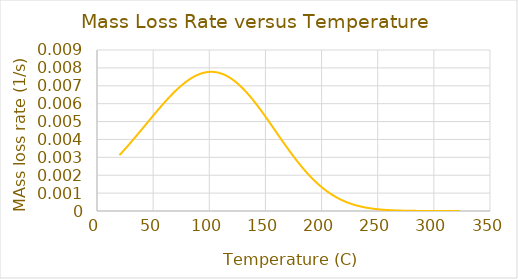
| Category | 1/s |
|---|---|
| 20.004478 | 0.003 |
| 20.99651 | 0.003 |
| 21.996464 | 0.003 |
| 22.99642 | 0.003 |
| 23.996374 | 0.003 |
| 24.99633 | 0.003 |
| 25.996284 | 0.004 |
| 26.996239 | 0.004 |
| 27.996193 | 0.004 |
| 28.996145 | 0.004 |
| 29.996099 | 0.004 |
| 30.996052 | 0.004 |
| 31.996004 | 0.004 |
| 32.995956 | 0.004 |
| 33.995911 | 0.004 |
| 34.995861 | 0.004 |
| 35.995815 | 0.004 |
| 36.995766 | 0.004 |
| 37.99572 | 0.004 |
| 38.99567 | 0.004 |
| 39.995621 | 0.005 |
| 40.995575 | 0.005 |
| 41.995525 | 0.005 |
| 42.99548 | 0.005 |
| 43.99543 | 0.005 |
| 44.995384 | 0.005 |
| 45.995335 | 0.005 |
| 46.995289 | 0.005 |
| 47.995239 | 0.005 |
| 48.995193 | 0.005 |
| 49.995144 | 0.005 |
| 50.995098 | 0.005 |
| 51.995052 | 0.005 |
| 52.995007 | 0.006 |
| 53.994961 | 0.006 |
| 54.994915 | 0.006 |
| 55.994873 | 0.006 |
| 56.994827 | 0.006 |
| 57.994781 | 0.006 |
| 58.99474 | 0.006 |
| 59.994698 | 0.006 |
| 60.994656 | 0.006 |
| 61.994614 | 0.006 |
| 62.994572 | 0.006 |
| 63.994534 | 0.006 |
| 64.994492 | 0.006 |
| 65.994453 | 0.006 |
| 66.994415 | 0.007 |
| 67.994377 | 0.007 |
| 68.994347 | 0.007 |
| 69.994308 | 0.007 |
| 70.994278 | 0.007 |
| 71.99424 | 0.007 |
| 72.994209 | 0.007 |
| 73.994179 | 0.007 |
| 74.994148 | 0.007 |
| 75.994118 | 0.007 |
| 76.994095 | 0.007 |
| 77.994064 | 0.007 |
| 78.994041 | 0.007 |
| 79.994019 | 0.007 |
| 80.993996 | 0.007 |
| 81.993973 | 0.007 |
| 82.99395 | 0.007 |
| 83.993935 | 0.007 |
| 84.993919 | 0.007 |
| 85.993896 | 0.007 |
| 86.993889 | 0.008 |
| 87.993874 | 0.008 |
| 88.993858 | 0.008 |
| 89.993851 | 0.008 |
| 90.993843 | 0.008 |
| 91.993835 | 0.008 |
| 92.993828 | 0.008 |
| 93.993828 | 0.008 |
| 94.99382 | 0.008 |
| 95.99382 | 0.008 |
| 96.99382 | 0.008 |
| 97.993828 | 0.008 |
| 98.993828 | 0.008 |
| 99.993835 | 0.008 |
| 100.99384 | 0.008 |
| 101.99385 | 0.008 |
| 102.99387 | 0.008 |
| 103.99387 | 0.008 |
| 104.99389 | 0.008 |
| 105.9939 | 0.008 |
| 106.99393 | 0.008 |
| 107.99394 | 0.008 |
| 108.99397 | 0.008 |
| 109.99399 | 0.008 |
| 110.99401 | 0.008 |
| 111.99404 | 0.008 |
| 112.99406 | 0.008 |
| 113.99409 | 0.008 |
| 114.99413 | 0.008 |
| 115.99416 | 0.008 |
| 116.99419 | 0.008 |
| 117.99423 | 0.007 |
| 118.99426 | 0.007 |
| 119.99431 | 0.007 |
| 120.99435 | 0.007 |
| 121.99438 | 0.007 |
| 122.99443 | 0.007 |
| 123.99448 | 0.007 |
| 124.99452 | 0.007 |
| 125.99457 | 0.007 |
| 126.99462 | 0.007 |
| 127.99467 | 0.007 |
| 128.99472 | 0.007 |
| 129.99478 | 0.007 |
| 130.99483 | 0.007 |
| 131.99489 | 0.007 |
| 132.99493 | 0.007 |
| 133.995 | 0.007 |
| 134.99506 | 0.007 |
| 135.99512 | 0.006 |
| 136.99518 | 0.006 |
| 137.99524 | 0.006 |
| 138.9953 | 0.006 |
| 139.99536 | 0.006 |
| 140.99542 | 0.006 |
| 141.9955 | 0.006 |
| 142.99556 | 0.006 |
| 143.99562 | 0.006 |
| 144.9957 | 0.006 |
| 145.99576 | 0.006 |
| 146.99583 | 0.006 |
| 147.9959 | 0.005 |
| 148.99597 | 0.005 |
| 149.99603 | 0.005 |
| 150.99611 | 0.005 |
| 151.99617 | 0.005 |
| 152.99625 | 0.005 |
| 153.99631 | 0.005 |
| 154.99638 | 0.005 |
| 155.99646 | 0.005 |
| 156.99652 | 0.005 |
| 157.9966 | 0.005 |
| 158.99666 | 0.004 |
| 159.99673 | 0.004 |
| 160.9968 | 0.004 |
| 161.99687 | 0.004 |
| 162.99695 | 0.004 |
| 163.99701 | 0.004 |
| 164.99709 | 0.004 |
| 165.99715 | 0.004 |
| 166.99721 | 0.004 |
| 167.99728 | 0.004 |
| 168.99734 | 0.004 |
| 169.99742 | 0.003 |
| 170.99748 | 0.003 |
| 171.99754 | 0.003 |
| 172.9976 | 0.003 |
| 173.99768 | 0.003 |
| 174.99774 | 0.003 |
| 175.9978 | 0.003 |
| 176.99786 | 0.003 |
| 177.99792 | 0.003 |
| 178.99799 | 0.003 |
| 179.99805 | 0.003 |
| 180.99809 | 0.003 |
| 181.99815 | 0.002 |
| 182.99821 | 0.002 |
| 183.99828 | 0.002 |
| 184.99832 | 0.002 |
| 185.99838 | 0.002 |
| 186.99843 | 0.002 |
| 187.99847 | 0.002 |
| 188.99854 | 0.002 |
| 189.99858 | 0.002 |
| 190.99863 | 0.002 |
| 191.99867 | 0.002 |
| 192.99872 | 0.002 |
| 193.99876 | 0.002 |
| 194.99881 | 0.002 |
| 195.99886 | 0.002 |
| 196.9989 | 0.002 |
| 197.99893 | 0.001 |
| 198.99898 | 0.001 |
| 199.99902 | 0.001 |
| 200.99905 | 0.001 |
| 201.9991 | 0.001 |
| 202.99913 | 0.001 |
| 203.99916 | 0.001 |
| 204.99919 | 0.001 |
| 205.99924 | 0.001 |
| 206.99927 | 0.001 |
| 207.9993 | 0.001 |
| 208.99933 | 0.001 |
| 209.99936 | 0.001 |
| 210.99937 | 0.001 |
| 211.9994 | 0.001 |
| 212.99944 | 0.001 |
| 213.99947 | 0.001 |
| 214.99948 | 0.001 |
| 215.99951 | 0.001 |
| 216.99953 | 0.001 |
| 217.99956 | 0.001 |
| 218.99957 | 0.001 |
| 219.9996 | 0.001 |
| 220.99962 | 0.001 |
| 221.99963 | 0.001 |
| 222.99965 | 0 |
| 223.99966 | 0 |
| 224.99968 | 0 |
| 225.99971 | 0 |
| 226.99973 | 0 |
| 227.99973 | 0 |
| 228.99974 | 0 |
| 229.99976 | 0 |
| 230.99977 | 0 |
| 231.99979 | 0 |
| 232.9998 | 0 |
| 233.9998 | 0 |
| 234.99982 | 0 |
| 235.99983 | 0 |
| 236.99983 | 0 |
| 237.99985 | 0 |
| 238.99986 | 0 |
| 239.99986 | 0 |
| 240.99988 | 0 |
| 241.99988 | 0 |
| 242.99989 | 0 |
| 243.99989 | 0 |
| 244.99991 | 0 |
| 245.99991 | 0 |
| 246.99991 | 0 |
| 247.99992 | 0 |
| 248.99992 | 0 |
| 249.99992 | 0 |
| 250.99994 | 0 |
| 251.99994 | 0 |
| 252.99994 | 0 |
| 253.99995 | 0 |
| 254.99995 | 0 |
| 255.99995 | 0 |
| 256.99997 | 0 |
| 257.99997 | 0 |
| 258.99997 | 0 |
| 259.99997 | 0 |
| 260.99997 | 0 |
| 261.99997 | 0 |
| 262.99997 | 0 |
| 263.99997 | 0 |
| 264.99997 | 0 |
| 265.99997 | 0 |
| 266.99997 | 0 |
| 267.99997 | 0 |
| 269.0 | 0 |
| 270.0 | 0 |
| 271.0 | 0 |
| 272.0 | 0 |
| 273.0 | 0 |
| 274.0 | 0 |
| 275.0 | 0 |
| 276.0 | 0 |
| 277.0 | 0 |
| 278.0 | 0 |
| 279.0 | 0 |
| 280.0 | 0 |
| 281.0 | 0 |
| 282.0 | 0 |
| 283.0 | 0 |
| 284.0 | 0 |
| 285.0 | 0 |
| 286.00003 | 0 |
| 287.0 | 0 |
| 288.0 | 0 |
| 289.00003 | 0 |
| 290.00003 | 0 |
| 291.00003 | 0 |
| 292.00006 | 0 |
| 293.00006 | 0 |
| 294.00006 | 0 |
| 295.00009 | 0 |
| 296.00012 | 0 |
| 297.00015 | 0 |
| 298.00015 | 0 |
| 299.00015 | 0 |
| 300.00018 | 0 |
| 301.00015 | 0 |
| 302.00018 | 0 |
| 303.00027 | 0 |
| 304.00031 | 0 |
| 305.00031 | 0 |
| 306.00034 | 0 |
| 307.00037 | 0 |
| 308.00034 | 0 |
| 309.00034 | 0 |
| 310.00034 | 0 |
| 311.00037 | 0 |
| 312.00037 | 0 |
| 313.0004 | 0 |
| 314.00064 | 0 |
| 315.00076 | 0 |
| 316.00079 | 0 |
| 317.00082 | 0 |
| 318.00089 | 0 |
| 319.00095 | 0 |
| 320.00134 | 0 |
| 321.00146 | 0 |
| 322.00162 | 0 |
| 323.00204 | 0 |